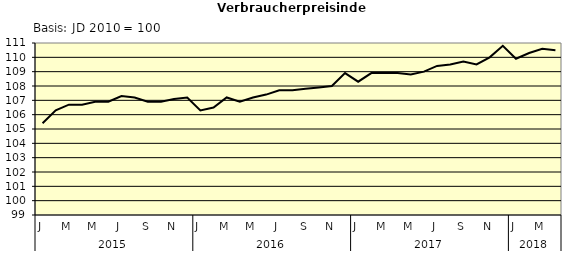
| Category | Series 0 |
|---|---|
| 0 | 105.4 |
| 1 | 106.3 |
| 2 | 106.7 |
| 3 | 106.7 |
| 4 | 106.9 |
| 5 | 106.9 |
| 6 | 107.3 |
| 7 | 107.2 |
| 8 | 106.9 |
| 9 | 106.9 |
| 10 | 107.1 |
| 11 | 107.2 |
| 12 | 106.3 |
| 13 | 106.5 |
| 14 | 107.2 |
| 15 | 106.9 |
| 16 | 107.2 |
| 17 | 107.4 |
| 18 | 107.7 |
| 19 | 107.7 |
| 20 | 107.8 |
| 21 | 107.9 |
| 22 | 108 |
| 23 | 108.9 |
| 24 | 108.3 |
| 25 | 108.9 |
| 26 | 108.9 |
| 27 | 108.9 |
| 28 | 108.8 |
| 29 | 109 |
| 30 | 109.4 |
| 31 | 109.5 |
| 32 | 109.7 |
| 33 | 109.5 |
| 34 | 110 |
| 35 | 110.8 |
| 36 | 109.9 |
| 37 | 110.3 |
| 38 | 110.6 |
| 39 | 110.5 |